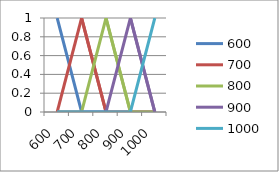
| Category | 600 | 700 | 800 | 900 | 1000 |
|---|---|---|---|---|---|
| 600.0 | 1 | 0 | 0 | 0 | 0 |
| 700.0 | 0 | 1 | 0 | 0 | 0 |
| 800.0 | 0 | 0 | 1 | 0 | 0 |
| 900.0 | 0 | 0 | 0 | 1 | 0 |
| 1000.0 | 0 | 0 | 0 | 0 | 1 |